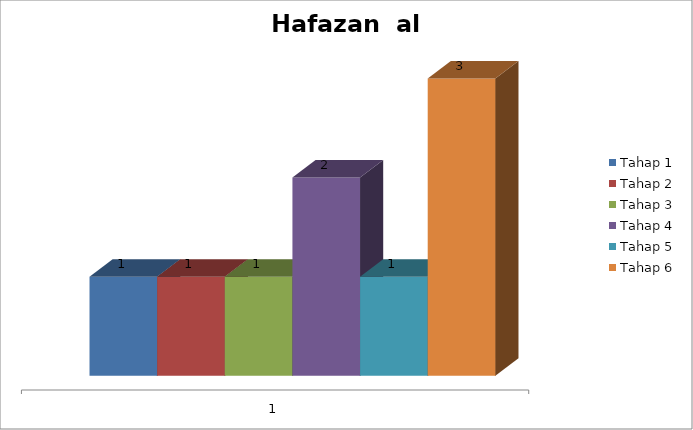
| Category | Tahap 1 | Tahap 2 | Tahap 3 | Tahap 4 | Tahap 5 | Tahap 6 |
|---|---|---|---|---|---|---|
| 0 | 1 | 1 | 1 | 2 | 1 | 3 |